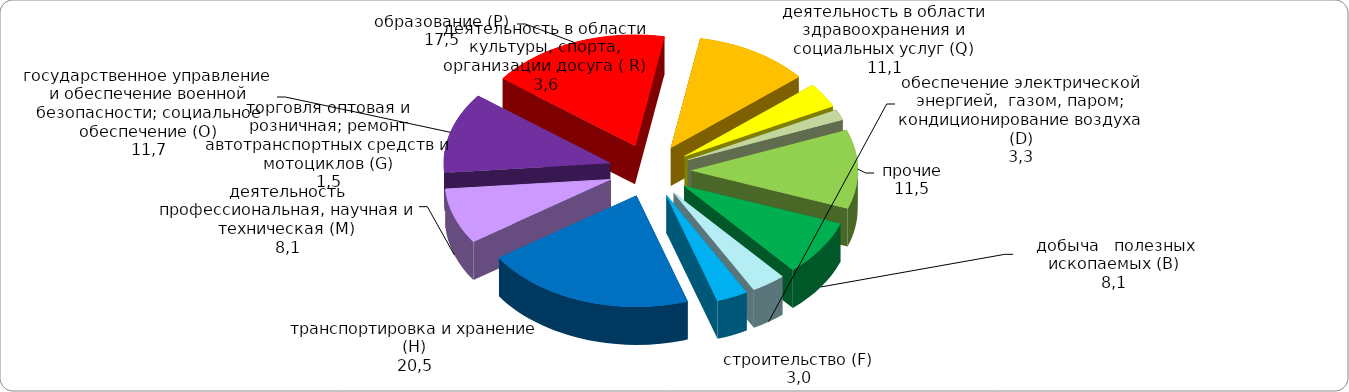
| Category | Series 3 | Series 2 | Series 1 | Series 0 |
|---|---|---|---|---|
|     добыча   полезных    ископаемых (В) | 8.102 |  |  |  |
| обеспечение электрической энергией,  газом, паром; кондиционирование воздуха (D) | 3.332 |  |  |  |
| строительство (F) | 3.04 |  |  |  |
| транспортировка и хранение (H) | 20.481 |  |  |  |
| деятельность профессиональная, научная и техническая (М) | 8.11 |  |  |  |
| государственное управление и обеспечение военной безопасности; социальное обеспечение (О) | 11.742 |  |  |  |
| образование (Р) | 17.455 |  |  |  |
| деятельность в области здравоохранения и социальных услуг (Q) | 11.135 |  |  |  |
| деятельность в области культуры, спорта, организации досуга ( R) | 3.579 |  |  |  |
| торговля оптовая и розничная; ремонт автотранспортных средств и мотоциклов (G) | 1.543 |  |  |  |
| прочие | 11.48 |  |  |  |